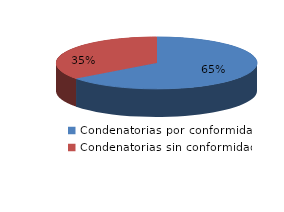
| Category | Series 0 |
|---|---|
| 0 | 2753 |
| 1 | 1501 |